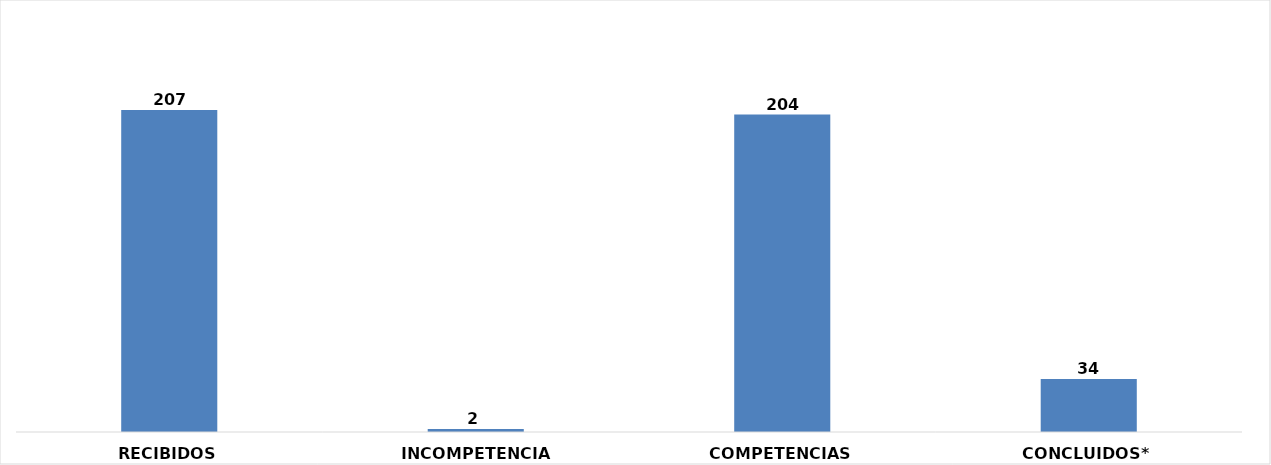
| Category | CANTIDAD |
|---|---|
| RECIBIDOS | 207 |
| INCOMPETENCIAS | 2 |
| COMPETENCIAS | 204 |
| CONCLUIDOS* | 34 |